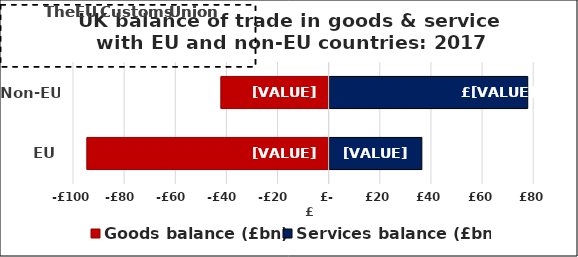
| Category | Goods balance (£bn) | Services balance (£bn) |
|---|---|---|
| EU | -94.726 | 36.434 |
| Non-EU | -42.309 | 77.861 |